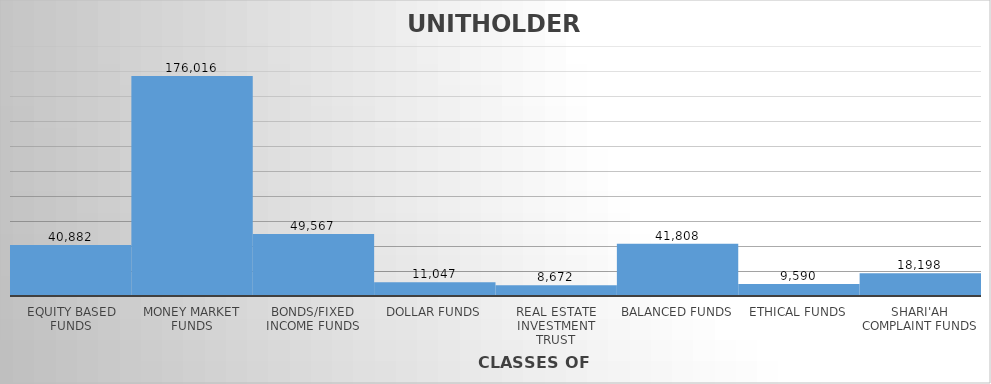
| Category | UNIT HOLDERS |
|---|---|
| EQUITY BASED FUNDS | 40882 |
| MONEY MARKET FUNDS | 176016 |
| BONDS/FIXED INCOME FUNDS | 49567 |
| DOLLAR FUNDS | 11047 |
| REAL ESTATE INVESTMENT TRUST | 8672 |
| BALANCED FUNDS | 41808 |
| ETHICAL FUNDS | 9590 |
| SHARI'AH COMPLAINT FUNDS | 18198 |